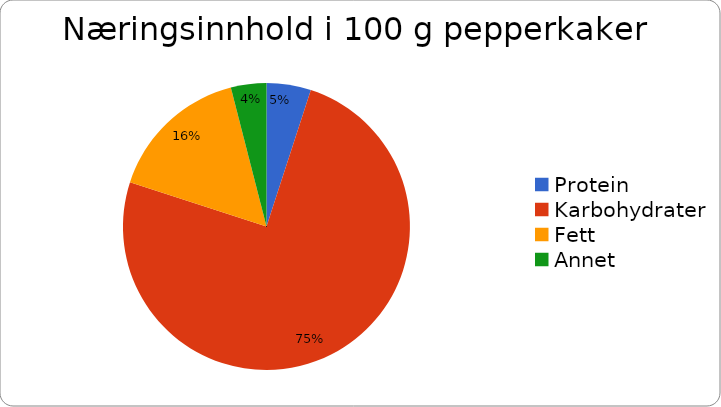
| Category | Prosent |
|---|---|
| Protein | 5 |
| Karbohydrater | 75 |
| Fett | 16 |
| Annet | 4 |